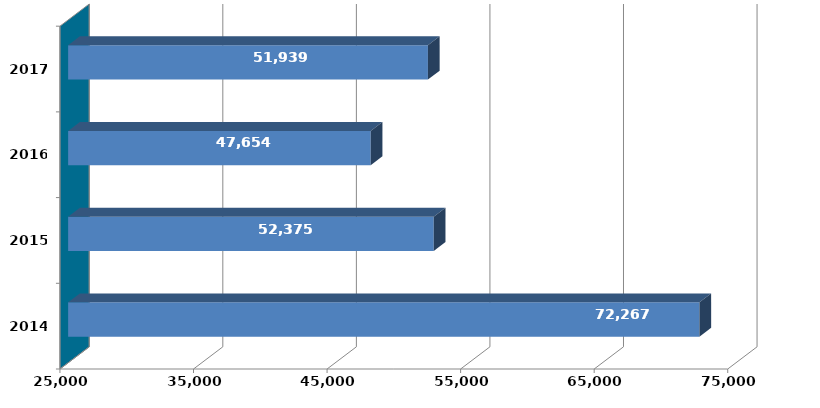
| Category | Column2 |
|---|---|
| 2014 | 72267043 |
| 2015 | 52374555 |
| 2016 | 47653822 |
| 2017 | 51938940 |